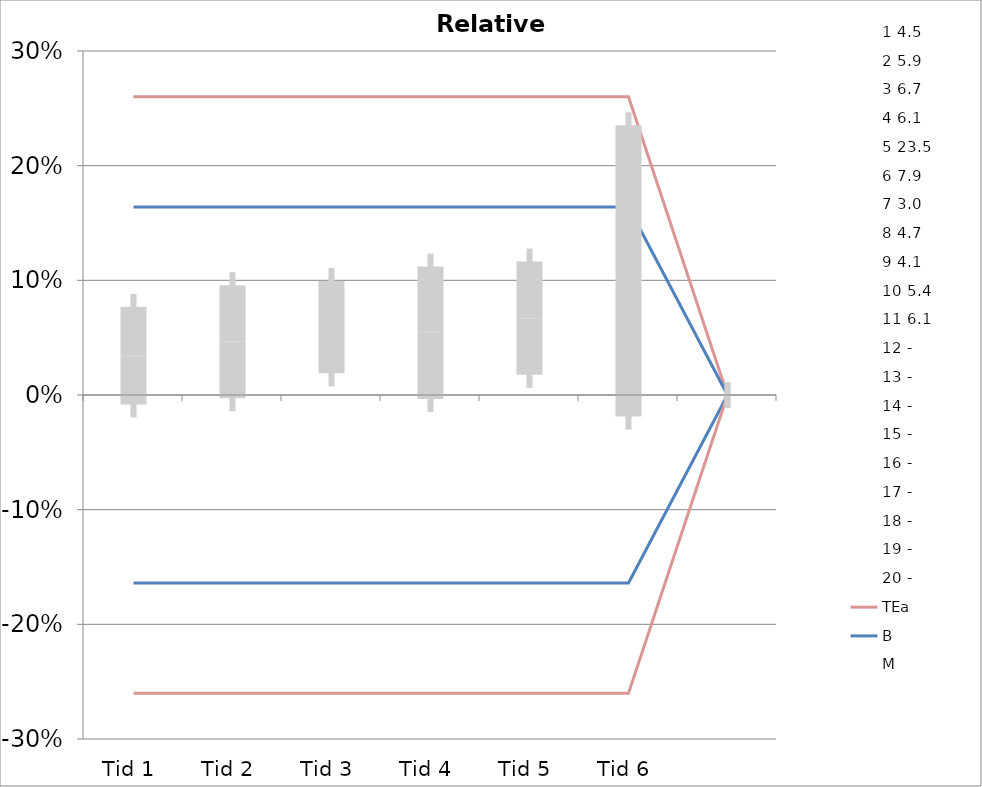
| Category | 1 | 2 | 3 | 4 | 5 | 6 | 7 | 8 | 9 | 10 | 11 | 12 | 13 | 14 | 15 | 16 | 17 | 18 | 19 | 20 | TEa | B | -B | -TEa | M |
|---|---|---|---|---|---|---|---|---|---|---|---|---|---|---|---|---|---|---|---|---|---|---|---|---|---|
| Tid 1 | 0.044 | 0.017 | 0 | -0.066 | -0.047 | -0.013 | 0.133 | 0.064 | 0.122 | 0.056 | 0.066 | 0 | 0 | 0 | 0 | 0 | 0 | 0 | 0 | 0 | 0.26 | 0.164 | -0.164 | -0.26 | 0.034 |
| Tid 2 | -0.022 | 0.017 | 0.03 | -0.082 | 0.013 | 0.051 | 0.167 | 0.064 | 0.171 | 0.056 | 0.049 | 0 | 0 | 0 | 0 | 0 | 0 | 0 | 0 | 0 | 0.26 | 0.164 | -0.164 | -0.26 | 0.047 |
| Tid 3 | 0.089 | 0.051 | 0.03 | 0 | -0.043 | 0.076 | 0.167 | 0.106 | 0.122 | 0.037 | 0.016 | 0 | 0 | 0 | 0 | 0 | 0 | 0 | 0 | 0 | 0.26 | 0.164 | -0.164 | -0.26 | 0.059 |
| Tid 4 | 0 | 0.068 | -0.015 | -0.066 | -0.034 | 0.165 | 0.167 | 0.106 | 0.171 | 0.019 | 0.016 | 0 | 0 | 0 | 0 | 0 | 0 | 0 | 0 | 0 | 0.26 | 0.164 | -0.164 | -0.26 | 0.054 |
| Tid 5 | 0 | 0 | 0 | 0 | 0 | 0 | 0 | 0.106 | 0.073 | 0.056 | 0.033 | 0 | 0 | 0 | 0 | 0 | 0 | 0 | 0 | 0 | 0.26 | 0.164 | -0.164 | -0.26 | 0.067 |
| Tid 6 | 0 | 0 | 0 | 0 | 0 | 0 | 0.267 | 0.106 | 0.073 | 0.111 | -0.016 | 0 | 0 | 0 | 0 | 0 | 0 | 0 | 0 | 0 | 0.26 | 0.164 | -0.164 | -0.26 | 0.108 |